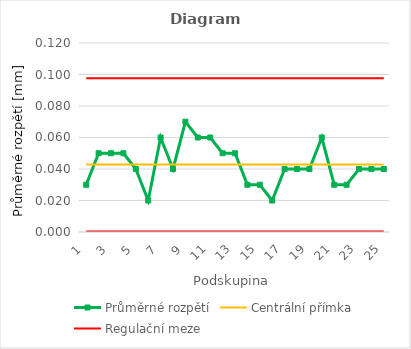
| Category | Průměrné rozpětí | Centrální přímka | Regulační meze |
|---|---|---|---|
| 1.0 | 0.03 | 0.043 | 0 |
| 2.0 | 0.05 | 0.043 | 0 |
| 3.0 | 0.05 | 0.043 | 0 |
| 4.0 | 0.05 | 0.043 | 0 |
| 5.0 | 0.04 | 0.043 | 0 |
| 6.0 | 0.02 | 0.043 | 0 |
| 7.0 | 0.06 | 0.043 | 0 |
| 8.0 | 0.04 | 0.043 | 0 |
| 9.0 | 0.07 | 0.043 | 0 |
| 10.0 | 0.06 | 0.043 | 0 |
| 11.0 | 0.06 | 0.043 | 0 |
| 12.0 | 0.05 | 0.043 | 0 |
| 13.0 | 0.05 | 0.043 | 0 |
| 14.0 | 0.03 | 0.043 | 0 |
| 15.0 | 0.03 | 0.043 | 0 |
| 16.0 | 0.02 | 0.043 | 0 |
| 17.0 | 0.04 | 0.043 | 0 |
| 18.0 | 0.04 | 0.043 | 0 |
| 19.0 | 0.04 | 0.043 | 0 |
| 20.0 | 0.06 | 0.043 | 0 |
| 21.0 | 0.03 | 0.043 | 0 |
| 22.0 | 0.03 | 0.043 | 0 |
| 23.0 | 0.04 | 0.043 | 0 |
| 24.0 | 0.04 | 0.043 | 0 |
| 25.0 | 0.04 | 0.043 | 0 |